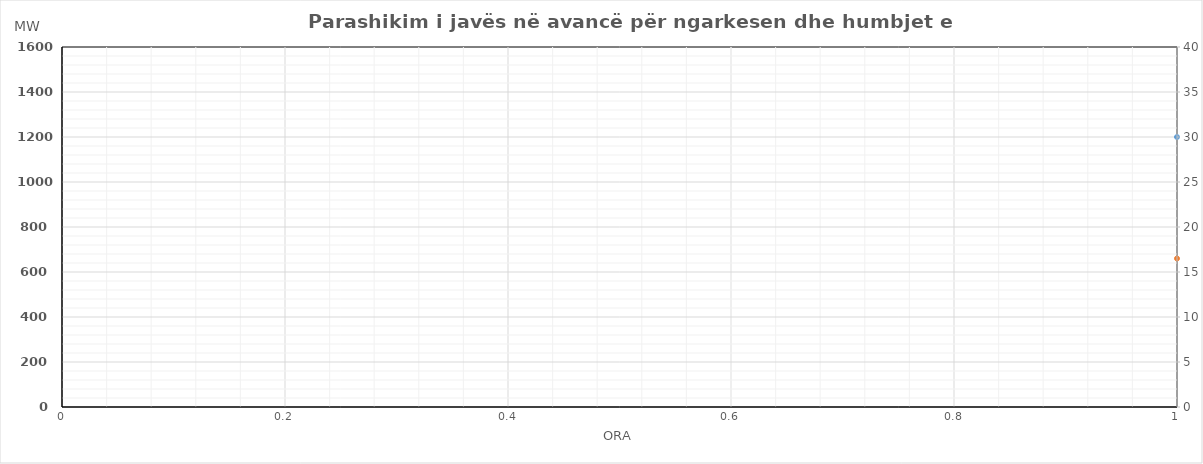
| Category | Ngarkesa (MWh) |
|---|---|
| 0 | 660 |
| 1 | 600 |
| 2 | 580 |
| 3 | 570 |
| 4 | 580 |
| 5 | 640 |
| 6 | 780 |
| 7 | 970 |
| 8 | 1120 |
| 9 | 1160 |
| 10 | 1150 |
| 11 | 1190 |
| 12 | 1190 |
| 13 | 1210 |
| 14 | 1180 |
| 15 | 1190 |
| 16 | 1250 |
| 17 | 1300 |
| 18 | 1300 |
| 19 | 1270 |
| 20 | 1230 |
| 21 | 1140 |
| 22 | 1010 |
| 23 | 850 |
| 24 | 660 |
| 25 | 600 |
| 26 | 580 |
| 27 | 570 |
| 28 | 580 |
| 29 | 640 |
| 30 | 780 |
| 31 | 970 |
| 32 | 1120 |
| 33 | 1160 |
| 34 | 1150 |
| 35 | 1240 |
| 36 | 1240 |
| 37 | 1260 |
| 38 | 1230 |
| 39 | 1240 |
| 40 | 1300 |
| 41 | 1350 |
| 42 | 1350 |
| 43 | 1320 |
| 44 | 1280 |
| 45 | 1190 |
| 46 | 1060 |
| 47 | 900 |
| 48 | 660 |
| 49 | 600 |
| 50 | 580 |
| 51 | 570 |
| 52 | 580 |
| 53 | 640 |
| 54 | 780 |
| 55 | 970 |
| 56 | 1120 |
| 57 | 1160 |
| 58 | 1150 |
| 59 | 1240 |
| 60 | 1240 |
| 61 | 1260 |
| 62 | 1230 |
| 63 | 1240 |
| 64 | 1300 |
| 65 | 1350 |
| 66 | 1350 |
| 67 | 1320 |
| 68 | 1280 |
| 69 | 1190 |
| 70 | 1060 |
| 71 | 900 |
| 72 | 660 |
| 73 | 600 |
| 74 | 580 |
| 75 | 570 |
| 76 | 580 |
| 77 | 640 |
| 78 | 780 |
| 79 | 970 |
| 80 | 1120 |
| 81 | 1160 |
| 82 | 1150 |
| 83 | 1240 |
| 84 | 1240 |
| 85 | 1260 |
| 86 | 1230 |
| 87 | 1240 |
| 88 | 1300 |
| 89 | 1350 |
| 90 | 1350 |
| 91 | 1320 |
| 92 | 1280 |
| 93 | 1190 |
| 94 | 1060 |
| 95 | 900 |
| 96 | 660 |
| 97 | 600 |
| 98 | 580 |
| 99 | 570 |
| 100 | 580 |
| 101 | 640 |
| 102 | 780 |
| 103 | 970 |
| 104 | 1120 |
| 105 | 1160 |
| 106 | 1150 |
| 107 | 1240 |
| 108 | 1240 |
| 109 | 1260 |
| 110 | 1230 |
| 111 | 1240 |
| 112 | 1300 |
| 113 | 1350 |
| 114 | 1350 |
| 115 | 1320 |
| 116 | 1280 |
| 117 | 1190 |
| 118 | 1060 |
| 119 | 900 |
| 120 | 660 |
| 121 | 600 |
| 122 | 580 |
| 123 | 570 |
| 124 | 580 |
| 125 | 640 |
| 126 | 780 |
| 127 | 970 |
| 128 | 1120 |
| 129 | 1160 |
| 130 | 1150 |
| 131 | 1240 |
| 132 | 1240 |
| 133 | 1260 |
| 134 | 1230 |
| 135 | 1240 |
| 136 | 1300 |
| 137 | 1350 |
| 138 | 1350 |
| 139 | 1320 |
| 140 | 1280 |
| 141 | 1190 |
| 142 | 1060 |
| 143 | 900 |
| 144 | 660 |
| 145 | 600 |
| 146 | 580 |
| 147 | 570 |
| 148 | 580 |
| 149 | 640 |
| 150 | 780 |
| 151 | 970 |
| 152 | 1120 |
| 153 | 1160 |
| 154 | 1150 |
| 155 | 1240 |
| 156 | 1240 |
| 157 | 1260 |
| 158 | 1230 |
| 159 | 1240 |
| 160 | 1300 |
| 161 | 1350 |
| 162 | 1350 |
| 163 | 1320 |
| 164 | 1280 |
| 165 | 1190 |
| 166 | 1060 |
| 167 | 900 |